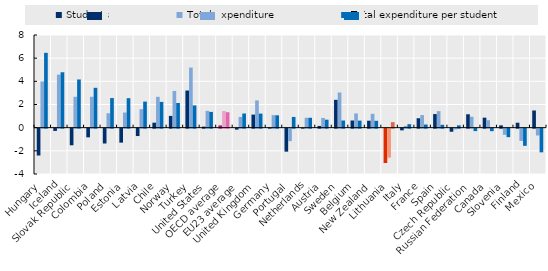
| Category | Students | Total expenditure | Total expenditure per student |
|---|---|---|---|
| Hungary | -2.318 | 3.993 | 6.461 |
| Iceland | -0.195 | 4.579 | 4.784 |
| Slovak Republic | -1.434 | 2.667 | 4.16 |
| Colombia | -0.748 | 2.667 | 3.441 |
| Poland | -1.279 | 1.244 | 2.556 |
| Estonia | -1.206 | 1.308 | 2.544 |
| Latvia | -0.637 | 1.599 | 2.25 |
| Chile | 0.43 | 2.665 | 2.225 |
| Norway | 1.016 | 3.17 | 2.132 |
| Turkey | 3.207 | 5.19 | 1.921 |
| United States | 0.09 | 1.453 | 1.362 |
| OECD average | 0.198 | 1.434 | 1.332 |
| EU23 average | -0.084 | 0.925 | 1.223 |
| United Kingdom | 1.129 | 2.356 | 1.213 |
| Germany | 0.015 | 1.082 | 1.067 |
| Portugal | -1.985 | -1.078 | 0.925 |
| Netherlands | -0.001 | 0.853 | 0.854 |
| Austria | 0.15 | 0.839 | 0.688 |
| Sweden | 2.404 | 3.036 | 0.617 |
| Belgium | 0.618 | 1.229 | 0.608 |
| New Zealand | 0.6 | 1.197 | 0.593 |
| Lithuania | -2.963 | -2.5 | 0.477 |
| Italy | -0.146 | 0.155 | 0.301 |
| France | 0.813 | 1.087 | 0.272 |
| Spain | 1.174 | 1.425 | 0.248 |
| Czech Republic | -0.266 | -0.065 | 0.201 |
| Russian Federation | 1.156 | 0.943 | -0.21 |
| Canada | 0.864 | 0.644 | -0.218 |
| Slovenia | 0.201 | -0.533 | -0.733 |
| Finland | 0.427 | -1.061 | -1.482 |
| Mexico | 1.483 | -0.589 | -2.042 |